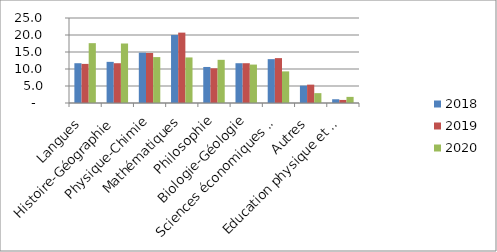
| Category | 2018 | 2019 | 2020 |
|---|---|---|---|
| Langues | 11.7 | 11.5 | 17.6 |
| Histoire-Géographie | 12.1 | 11.7 | 17.5 |
| Physique-Chimie | 14.8 | 14.7 | 13.5 |
| Mathématiques | 20 | 20.7 | 13.4 |
| Philosophie | 10.6 | 10.2 | 12.7 |
| Biologie-Géologie | 11.7 | 11.7 | 11.3 |
| Sciences économiques et sociales | 12.9 | 13.2 | 9.3 |
| Autres | 5.1 | 5.4 | 2.9 |
| Education physique et sportive | 1.1 | 0.9 | 1.8 |